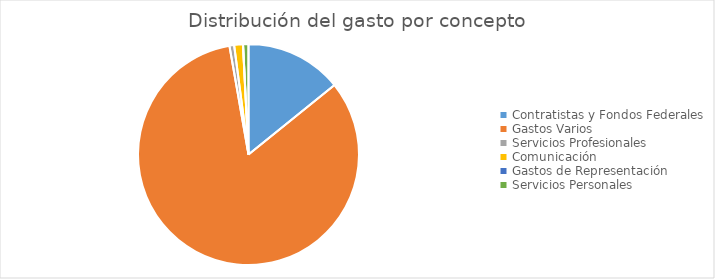
| Category | Series 0 |
|---|---|
| Contratistas y Fondos Federales | 85330304.27 |
| Gastos Varios | 499492908.32 |
| Servicios Profesionales | 4105653.28 |
| Comunicación | 7725505.64 |
| Gastos de Representación | 68892.61 |
| Servicios Personales | 4744804.37 |